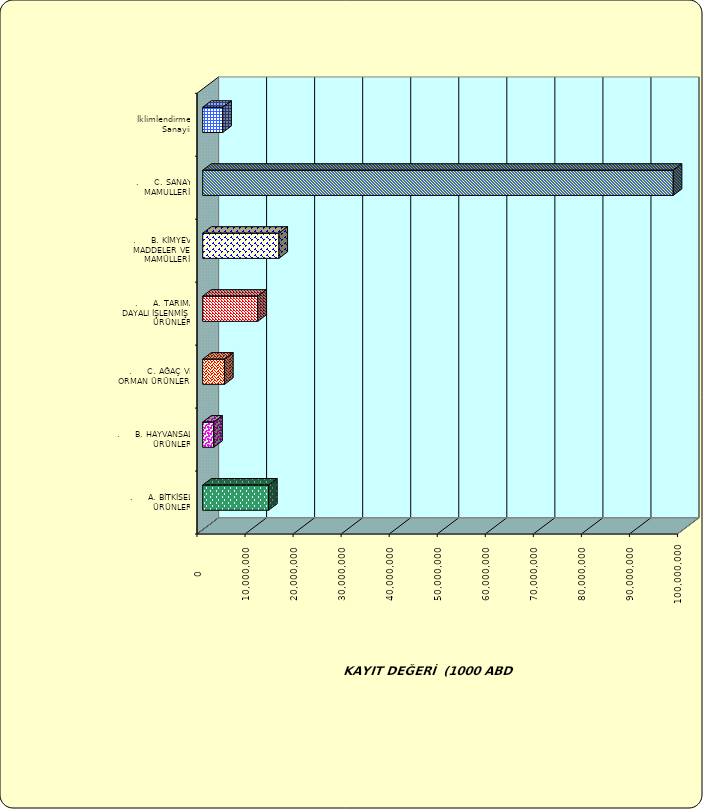
| Category | Series 0 |
|---|---|
| .     A. BİTKİSEL ÜRÜNLER | 13716914.437 |
| .     B. HAYVANSAL ÜRÜNLER | 2300361.81 |
| .     C. AĞAÇ VE ORMAN ÜRÜNLERİ | 4557231.29 |
| .     A. TARIMA DAYALI İŞLENMİŞ ÜRÜNLER | 11467798.291 |
| .     B. KİMYEVİ MADDELER VE MAMÜLLERİ | 15871820.303 |
| .     C. SANAYİ MAMULLERİ | 97937391.87 |
|  İklimlendirme Sanayii | 4181573.691 |